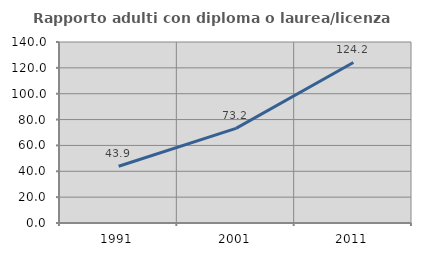
| Category | Rapporto adulti con diploma o laurea/licenza media  |
|---|---|
| 1991.0 | 43.87 |
| 2001.0 | 73.207 |
| 2011.0 | 124.173 |